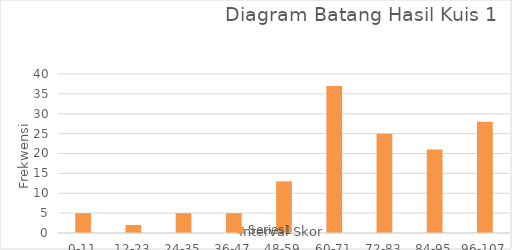
| Category | Series 0 |
|---|---|
| 0-11 | 5 |
| 12-23 | 2 |
| 24-35 | 5 |
| 36-47 | 5 |
| 48-59 | 13 |
| 60-71 | 37 |
| 72-83 | 25 |
| 84-95 | 21 |
| 96-107 | 28 |